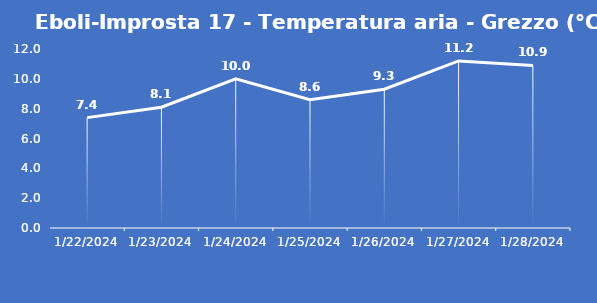
| Category | Eboli-Improsta 17 - Temperatura aria - Grezzo (°C) |
|---|---|
| 1/22/24 | 7.4 |
| 1/23/24 | 8.1 |
| 1/24/24 | 10 |
| 1/25/24 | 8.6 |
| 1/26/24 | 9.3 |
| 1/27/24 | 11.2 |
| 1/28/24 | 10.9 |